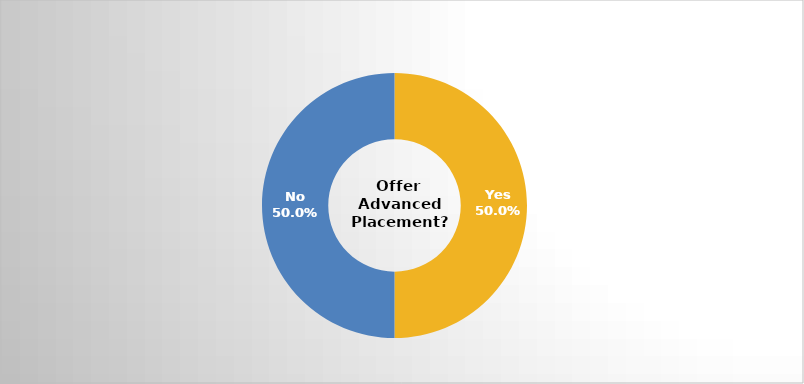
| Category | Series 0 |
|---|---|
| Yes | 0.5 |
| No | 0.5 |